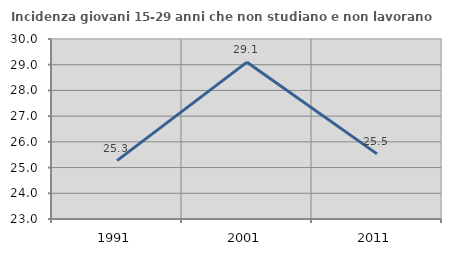
| Category | Incidenza giovani 15-29 anni che non studiano e non lavorano  |
|---|---|
| 1991.0 | 25.271 |
| 2001.0 | 29.099 |
| 2011.0 | 25.532 |